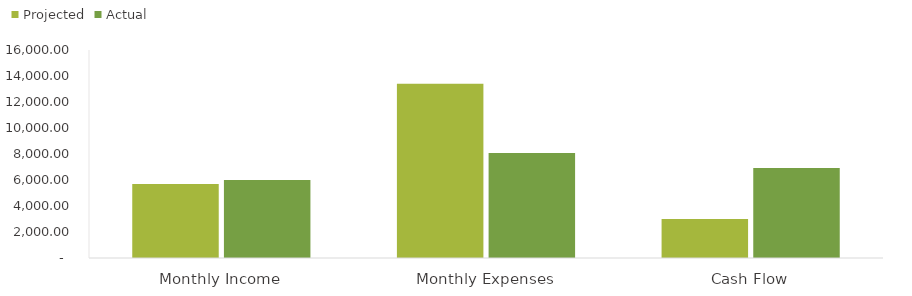
| Category | Projected | Actual |
|---|---|---|
| Monthly Income | 5700 | 6000 |
| Monthly Expenses | 13406 | 8070 |
| Cash Flow | 3000 | 6930 |